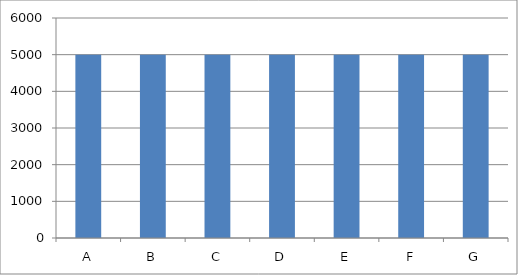
| Category | Series 0 |
|---|---|
| A | 5000.171 |
| B | 4999.852 |
| C | 5000.328 |
| D | 4999.853 |
| E | 5000.083 |
| F | 4999.807 |
| G | 4999.785 |